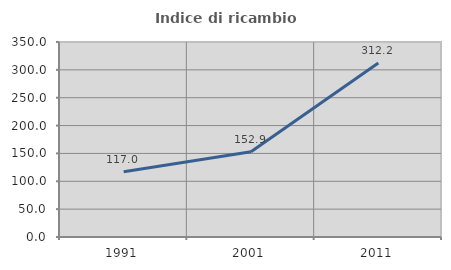
| Category | Indice di ricambio occupazionale  |
|---|---|
| 1991.0 | 117.049 |
| 2001.0 | 152.896 |
| 2011.0 | 312.207 |